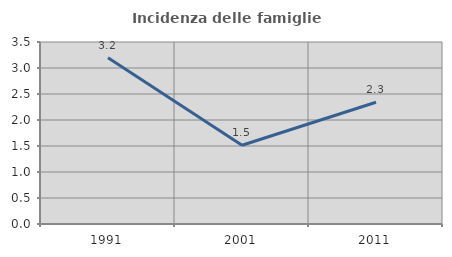
| Category | Incidenza delle famiglie numerose |
|---|---|
| 1991.0 | 3.196 |
| 2001.0 | 1.514 |
| 2011.0 | 2.342 |